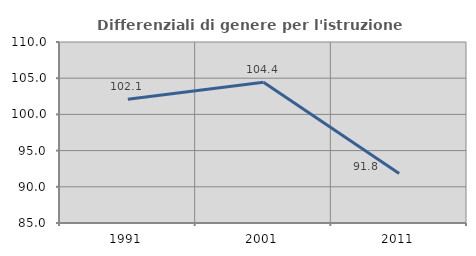
| Category | Differenziali di genere per l'istruzione superiore |
|---|---|
| 1991.0 | 102.1 |
| 2001.0 | 104.439 |
| 2011.0 | 91.829 |